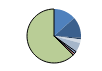
| Category | Series 0 |
|---|---|
| ARRASTRE | 144 |
| CERCO | 135 |
| ATUNEROS CAÑEROS | 11 |
| PALANGRE DE FONDO | 23 |
| PALANGRE DE SUPERFICIE | 55 |
| RASCO | 6 |
| VOLANTA | 14 |
| ARTES FIJAS | 13 |
| ARTES MENORES | 672 |